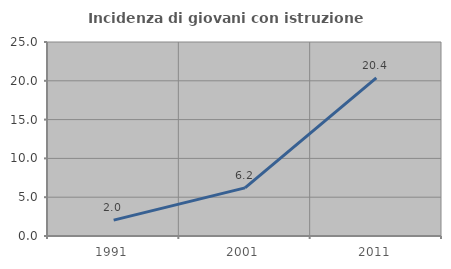
| Category | Incidenza di giovani con istruzione universitaria |
|---|---|
| 1991.0 | 2.048 |
| 2001.0 | 6.199 |
| 2011.0 | 20.384 |